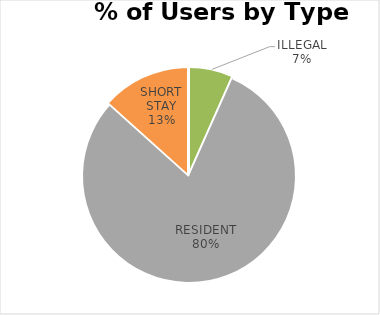
| Category | REYNOLDS PLACE |
|---|---|
| COMMUTER | 0 |
| ILLEGAL | 1 |
| LONG STAY | 0 |
| RESIDENT | 12 |
| SHORT STAY | 2 |
| DISABLED | 0 |
| OTHER | 0 |